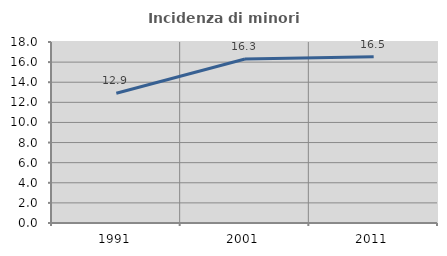
| Category | Incidenza di minori stranieri |
|---|---|
| 1991.0 | 12.903 |
| 2001.0 | 16.312 |
| 2011.0 | 16.535 |